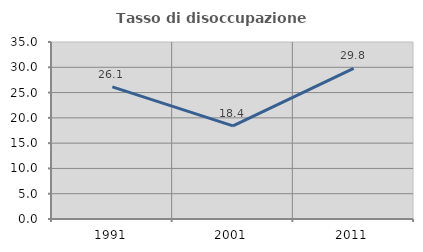
| Category | Tasso di disoccupazione giovanile  |
|---|---|
| 1991.0 | 26.129 |
| 2001.0 | 18.408 |
| 2011.0 | 29.801 |